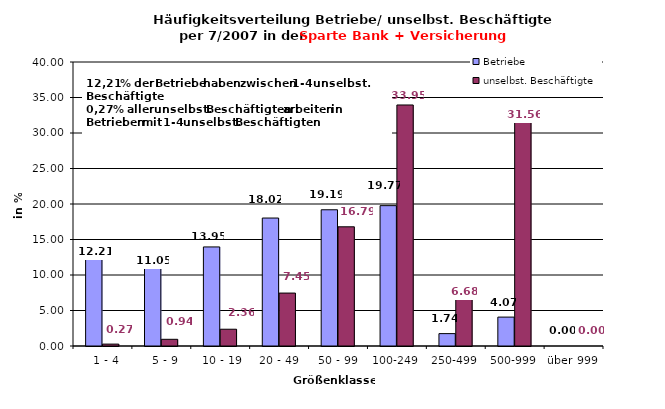
| Category | Betriebe | unselbst. Beschäftigte |
|---|---|---|
|   1 - 4 | 12.209 | 0.267 |
|   5 - 9 | 11.047 | 0.942 |
|  10 - 19 | 13.953 | 2.363 |
| 20 - 49 | 18.023 | 7.455 |
| 50 - 99 | 19.186 | 16.787 |
| 100-249 | 19.767 | 33.948 |
| 250-499 | 1.744 | 6.681 |
| 500-999 | 4.07 | 31.556 |
| über 999 | 0 | 0 |